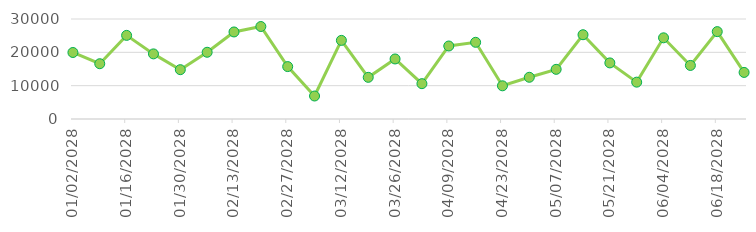
| Category | Series 0 |
|---|---|
| 01/02/2028 | 19953 |
| 01/09/2028 | 16584 |
| 01/16/2028 | 25090 |
| 01/23/2028 | 19536 |
| 01/30/2028 | 14798 |
| 02/06/2028 | 20021 |
| 02/13/2028 | 26114 |
| 02/20/2028 | 27746 |
| 02/27/2028 | 15723 |
| 03/05/2028 | 6899 |
| 03/12/2028 | 23585 |
| 03/19/2028 | 12499 |
| 03/26/2028 | 18013 |
| 04/02/2028 | 10601 |
| 04/09/2028 | 21902 |
| 04/16/2028 | 23008 |
| 04/23/2028 | 9960 |
| 04/30/2028 | 12518 |
| 05/07/2028 | 14897 |
| 05/14/2028 | 25280 |
| 05/21/2028 | 16828 |
| 05/28/2028 | 11055 |
| 06/04/2028 | 24356 |
| 06/11/2028 | 16066 |
| 06/18/2028 | 26216 |
| 06/25/2028 | 13970 |